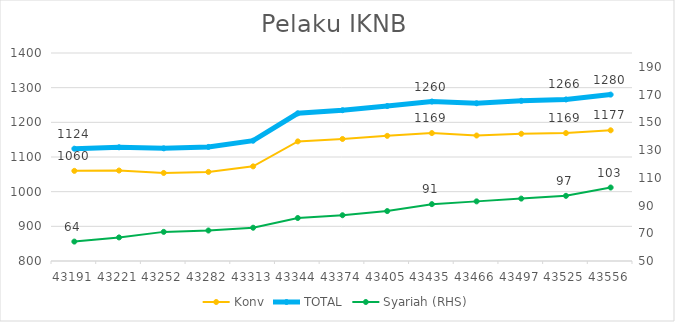
| Category | Konv | TOTAL |
|---|---|---|
| 43191.0 | 1060 | 1124 |
| 43221.0 | 1061 | 1128 |
| 43252.0 | 1054 | 1125 |
| 43282.0 | 1057 | 1129 |
| 43313.0 | 1073 | 1147 |
| 43344.0 | 1145 | 1226 |
| 43374.0 | 1152 | 1235 |
| 43405.0 | 1161 | 1247 |
| 43435.0 | 1169 | 1260 |
| 43466.0 | 1162 | 1255 |
| 43497.0 | 1167 | 1262 |
| 43525.0 | 1169 | 1266 |
| 43556.0 | 1177 | 1280 |